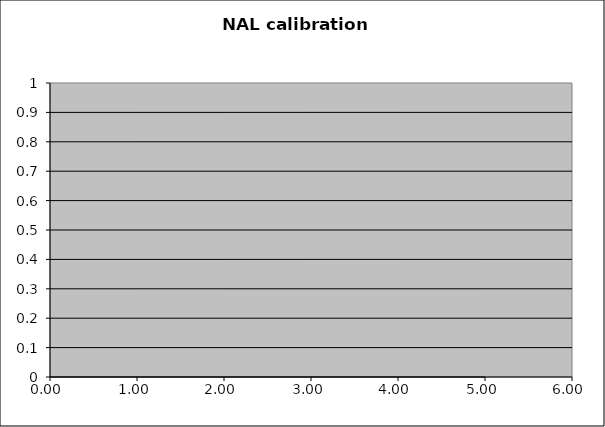
| Category | Series 0 |
|---|---|
| 5.0 | 0 |
| 2.5 | 0 |
| 1.25 | 0 |
| 0.625 | 0 |
| 0.3125 | 0 |
| 0.15625 | 0 |
| 0.0 | 0 |